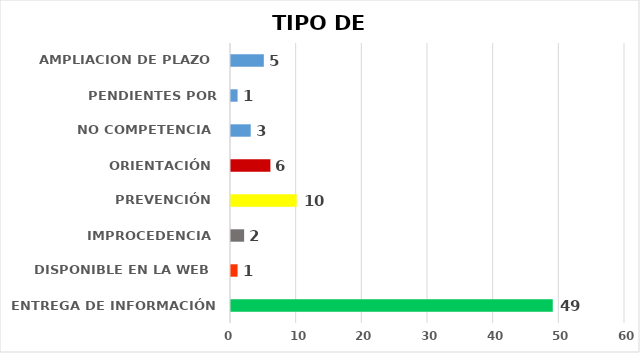
| Category | CANTIDAD DE RESPUESTAS |
|---|---|
| ENTREGA DE INFORMACIÓN | 49 |
| DISPONIBLE EN LA WEB | 1 |
| IMPROCEDENCIA | 2 |
| PREVENCIÓN | 10 |
| ORIENTACIÓN | 6 |
| NO COMPETENCIA | 3 |
| PENDIENTES POR CONTESTAR | 1 |
| AMPLIACION DE PLAZO | 5 |